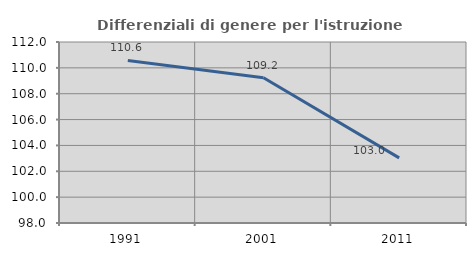
| Category | Differenziali di genere per l'istruzione superiore |
|---|---|
| 1991.0 | 110.574 |
| 2001.0 | 109.241 |
| 2011.0 | 103.034 |